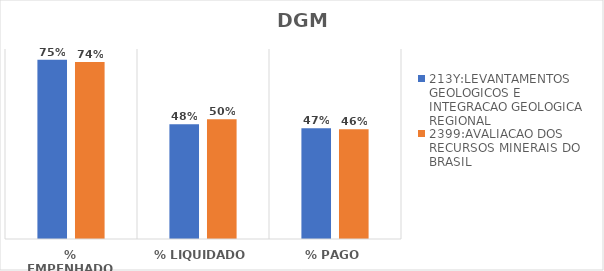
| Category | 213Y:LEVANTAMENTOS GEOLOGICOS E INTEGRACAO GEOLOGICA REGIONAL | 2399:AVALIACAO DOS RECURSOS MINERAIS DO BRASIL |
|---|---|---|
| % EMPENHADO | 0.755 | 0.745 |
| % LIQUIDADO | 0.483 | 0.504 |
| % PAGO | 0.466 | 0.462 |